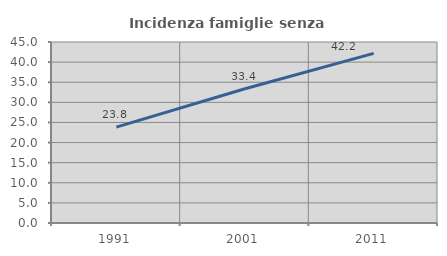
| Category | Incidenza famiglie senza nuclei |
|---|---|
| 1991.0 | 23.844 |
| 2001.0 | 33.373 |
| 2011.0 | 42.176 |